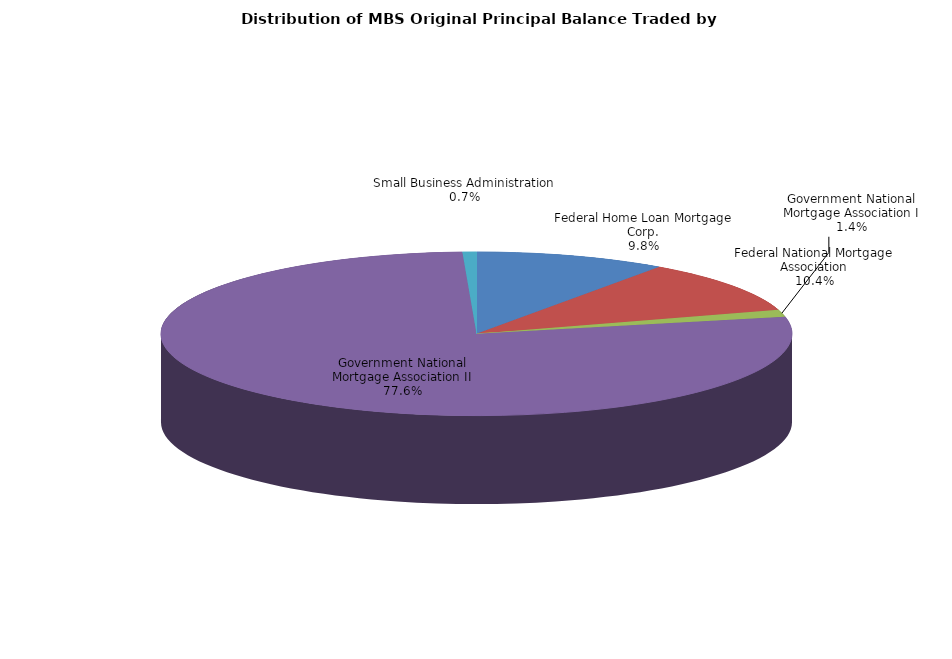
| Category | Series 0 |
|---|---|
| Federal Home Loan Mortgage Corp. | 1040345884.17 |
| Federal National Mortgage Association | 1107786487.48 |
| Government National Mortgage Association I | 146302079.839 |
| Government National Mortgage Association II | 8231635044.545 |
| Small Business Administration | 75794114.484 |